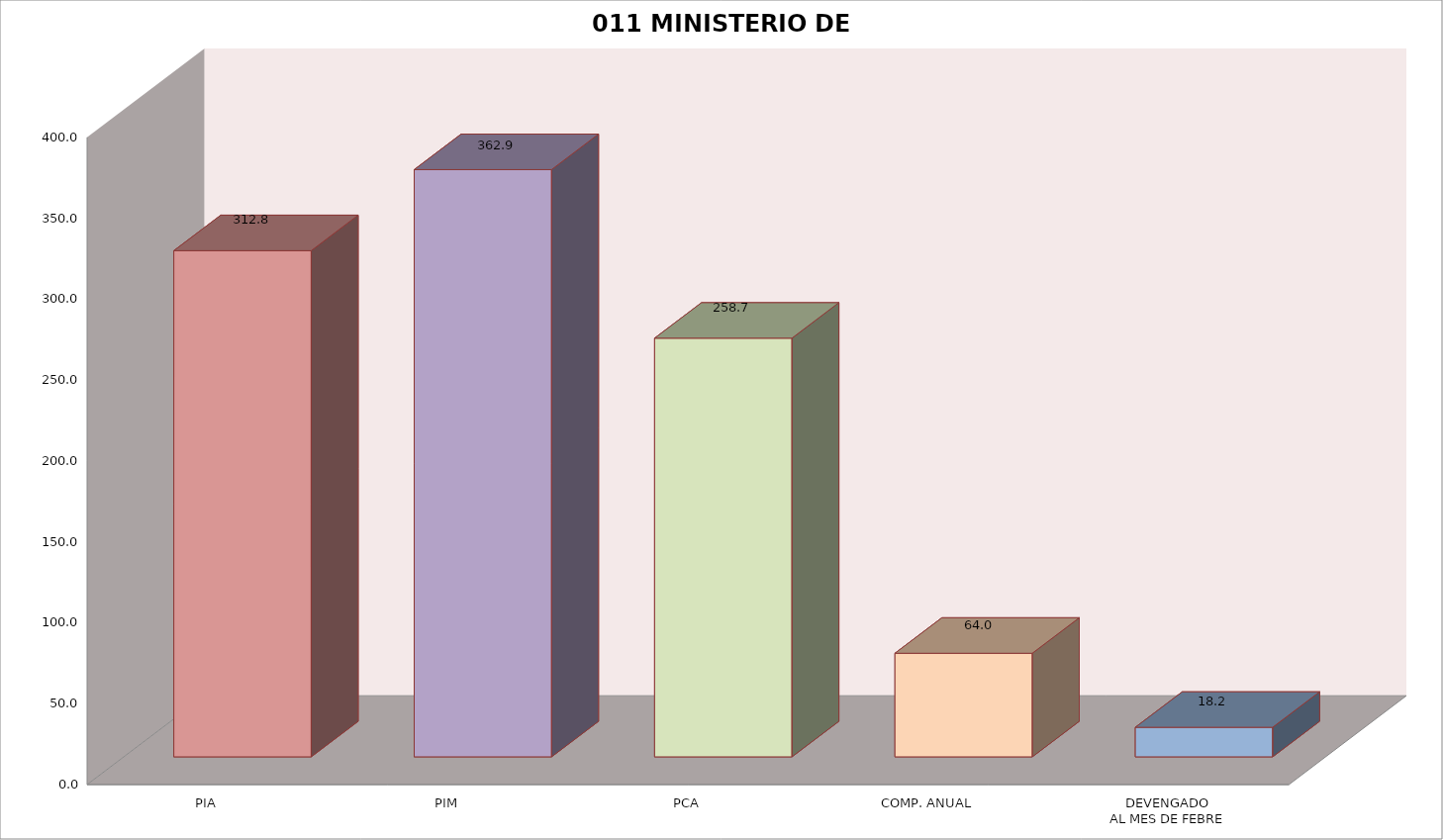
| Category | 011 MINISTERIO DE SALUD |
|---|---|
| PIA | 312.801 |
| PIM | 362.893 |
| PCA | 258.721 |
| COMP. ANUAL | 64.012 |
| DEVENGADO
AL MES DE FEBRE | 18.242 |